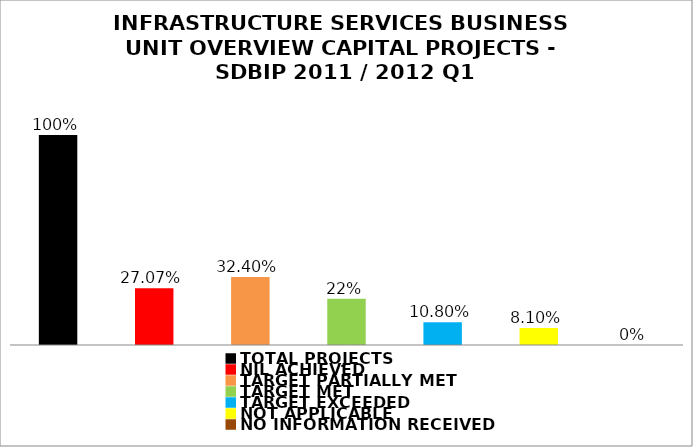
| Category | Series 1 |
|---|---|
| TOTAL PROJECTS | 1 |
| NIL ACHIEVED | 0.271 |
| TARGET PARTIALLY MET | 0.324 |
| TARGET MET | 0.22 |
| TARGET EXCEEDED | 0.108 |
| NOT APPLICABLE | 0.081 |
| NO INFORMATION RECEIVED | 0 |